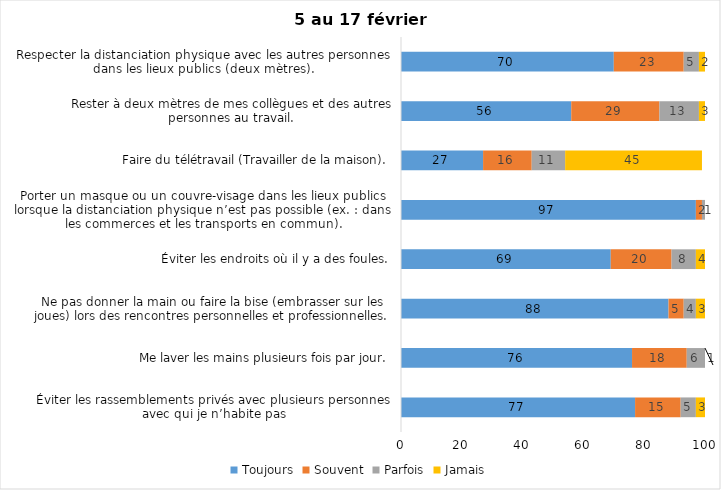
| Category | Toujours | Souvent | Parfois | Jamais |
|---|---|---|---|---|
| Éviter les rassemblements privés avec plusieurs personnes avec qui je n’habite pas | 77 | 15 | 5 | 3 |
| Me laver les mains plusieurs fois par jour. | 76 | 18 | 6 | 1 |
| Ne pas donner la main ou faire la bise (embrasser sur les joues) lors des rencontres personnelles et professionnelles. | 88 | 5 | 4 | 3 |
| Éviter les endroits où il y a des foules. | 69 | 20 | 8 | 4 |
| Porter un masque ou un couvre-visage dans les lieux publics lorsque la distanciation physique n’est pas possible (ex. : dans les commerces et les transports en commun). | 97 | 2 | 1 | 0 |
| Faire du télétravail (Travailler de la maison). | 27 | 16 | 11 | 45 |
| Rester à deux mètres de mes collègues et des autres personnes au travail. | 56 | 29 | 13 | 3 |
| Respecter la distanciation physique avec les autres personnes dans les lieux publics (deux mètres). | 70 | 23 | 5 | 2 |